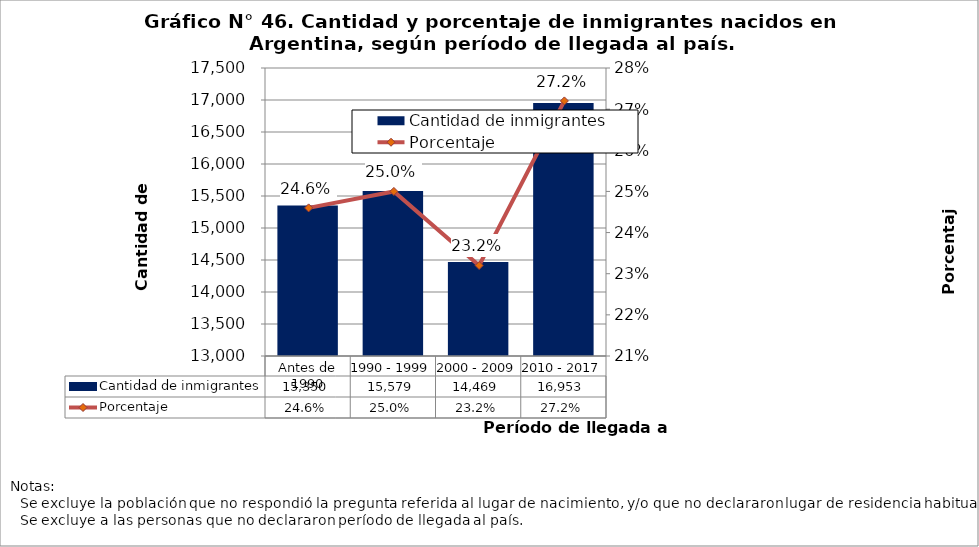
| Category | Cantidad de inmigrantes |
|---|---|
| Antes de 1990 | 15350 |
| 1990 - 1999 | 15579 |
| 2000 - 2009 | 14469 |
| 2010 - 2017 | 16953 |